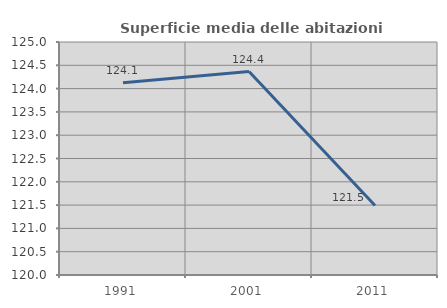
| Category | Superficie media delle abitazioni occupate |
|---|---|
| 1991.0 | 124.123 |
| 2001.0 | 124.366 |
| 2011.0 | 121.492 |